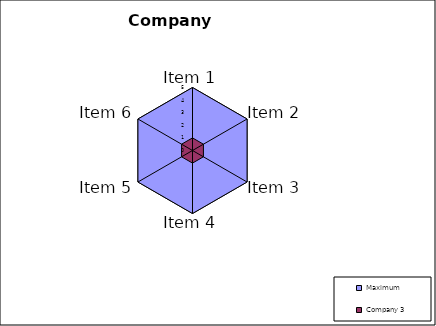
| Category | Maximum | Company 3 |
|---|---|---|
| Item 1 | 5 | 1 |
| Item 2 | 5 | 1 |
| Item 3 | 5 | 1 |
| Item 4 | 5 | 1 |
| Item 5 | 5 | 1 |
| Item 6 | 5 | 1 |